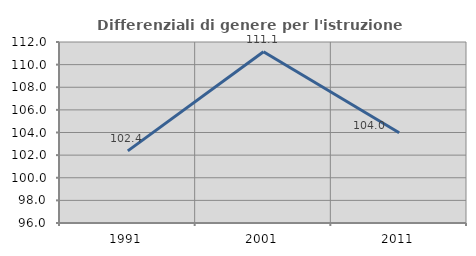
| Category | Differenziali di genere per l'istruzione superiore |
|---|---|
| 1991.0 | 102.373 |
| 2001.0 | 111.143 |
| 2011.0 | 103.971 |